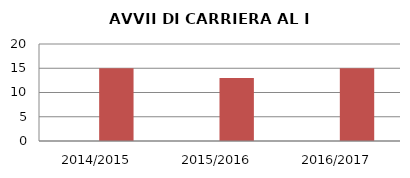
| Category | ANNO | NUMERO |
|---|---|---|
| 2014/2015 | 0 | 15 |
| 2015/2016 | 0 | 13 |
| 2016/2017 | 0 | 15 |